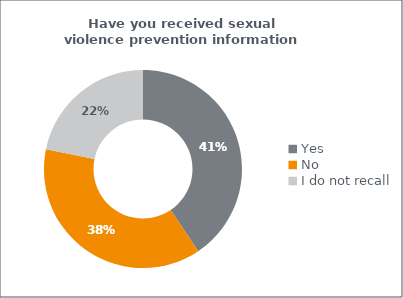
| Category | Series 0 |
|---|---|
| Yes | 0.406 |
| No | 0.376 |
| I do not recall | 0.218 |